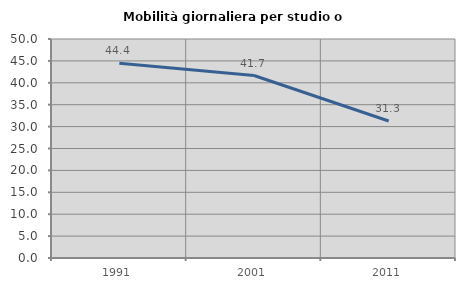
| Category | Mobilità giornaliera per studio o lavoro |
|---|---|
| 1991.0 | 44.444 |
| 2001.0 | 41.667 |
| 2011.0 | 31.288 |